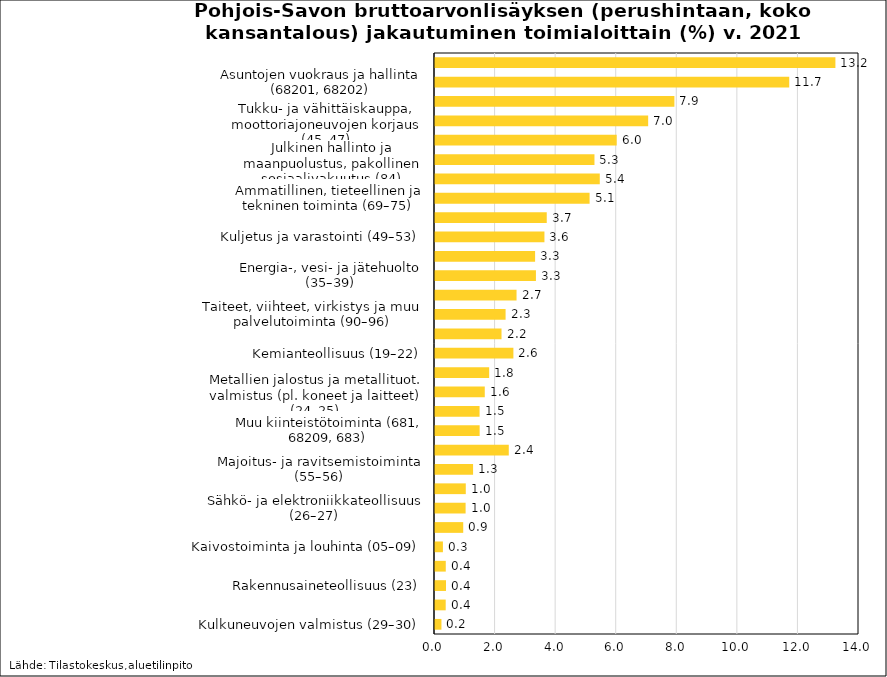
| Category | Osuus (%) kaikista 
toimialoista v. 2021 |
|---|---|
| Kulkuneuvojen valmistus (29–30) | 0.213 |
| Tekstiiliteollisuus (13–15) | 0.353 |
| Rakennusaineteollisuus (23) | 0.363 |
| Kotitalouspalvelut (97–98) | 0.356 |
| Kaivostoiminta ja louhinta (05–09) | 0.261 |
| Paperiteollisuus ja painaminen (17–18) | 0.932 |
| Sähkö- ja elektroniikkateollisuus (26–27) | 1.01 |
| Huonekalujen ym. valmistus, koneiden ja laitteiden huolto ja asennus (31–33) | 1.017 |
| Majoitus- ja ravitsemistoiminta (55–56) | 1.257 |
| Puuteollisuus (16) | 2.436 |
| Muu kiinteistötoiminta (681, 68209, 683) | 1.474 |
| Maatalous- ja metsästys (01) | 1.472 |
| Metallien jalostus ja metallituot. valmistus (pl. koneet ja laitteet) (24–25) | 1.643 |
| Elintarviketeollisuus ym. (10–12) | 1.789 |
| Kemianteollisuus (19–22) | 2.589 |
| Informaatio ja viestintä (58–63) | 2.196 |
| Taiteet, viihteet, virkistys ja muu palvelutoiminta (90–96) | 2.331 |
| Rahoitus- ja vakuutustoiminta (64–66) | 2.693 |
| Energia-, vesi- ja jätehuolto (35–39) | 3.333 |
| Hallinto- ja tukipalvelutoiminta (77–82) | 3.305 |
| Kuljetus ja varastointi (49–53) | 3.614 |
| Muiden koneiden ja laitteiden valmistus (28) | 3.69 |
| Ammatillinen, tieteellinen ja tekninen toiminta (69–75) | 5.104 |
| Metsätalous ja kalatalous (02–03) | 5.441 |
| Julkinen hallinto ja maanpuolustus, pakollinen sosiaalivakuutus (84) | 5.265 |
| Koulutus (85) | 6 |
| Tukku- ja vähittäiskauppa, moottoriajoneuvojen korjaus (45–47) | 7.038 |
| Rakentaminen (41–43) | 7.905 |
| Asuntojen vuokraus ja hallinta (68201, 68202) | 11.696 |
| Terveys- ja sosiaalipalvelut (86–88) | 13.221 |